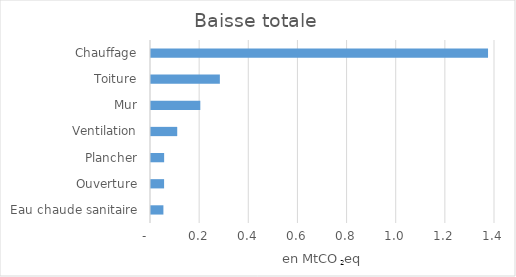
| Category | Baisse totale |
|---|---|
| Eau chaude sanitaire | 0.05 |
| Ouverture | 0.053 |
| Plancher | 0.053 |
| Ventilation | 0.107 |
| Mur | 0.201 |
| Toiture | 0.28 |
| Chauffage | 1.372 |